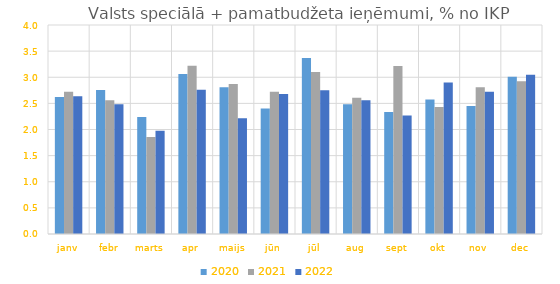
| Category | 2020 | 2021 | 2022 |
|---|---|---|---|
| janv | 2.62 | 2.724 | 2.638 |
| febr | 2.756 | 2.561 | 2.483 |
| marts | 2.241 | 1.858 | 1.974 |
| apr | 3.064 | 3.221 | 2.763 |
| maijs | 2.809 | 2.869 | 2.216 |
| jūn | 2.401 | 2.721 | 2.678 |
| jūl | 3.366 | 3.102 | 2.75 |
| aug | 2.481 | 2.607 | 2.56 |
| sept | 2.336 | 3.215 | 2.268 |
| okt | 2.575 | 2.432 | 2.901 |
| nov | 2.45 | 2.808 | 2.721 |
| dec | 3.008 | 2.925 | 3.048 |